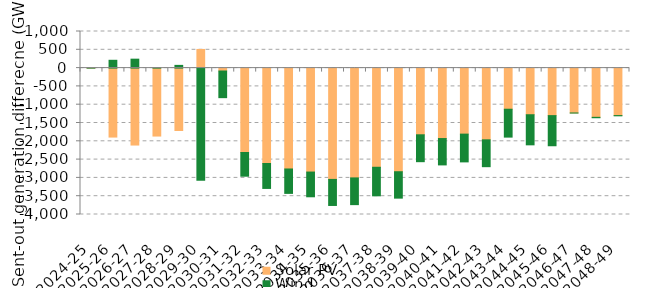
| Category | Solar PV | Wind | Offshore wind |
|---|---|---|---|
| 2024-25 | -0.437 | 0.261 | 0 |
| 2025-26 | -1884.587 | 213.413 | 0 |
| 2026-27 | -2102.259 | 244.121 | 0 |
| 2027-28 | -1856.682 | 11.29 | 0 |
| 2028-29 | -1704.798 | 74.339 | 0 |
| 2029-30 | 509.71 | -3064.85 | 0 |
| 2030-31 | -79.45 | -728.203 | 0 |
| 2031-32 | -2305.976 | -647.668 | 0 |
| 2032-33 | -2605.988 | -681.789 | 0 |
| 2033-34 | -2756.382 | -666.945 | 0 |
| 2034-35 | -2840.185 | -675.785 | 0 |
| 2035-36 | -3041.288 | -712.021 | 0 |
| 2036-37 | -3000.111 | -730.215 | 0 |
| 2037-38 | -2709.602 | -779.807 | 0 |
| 2038-39 | -2831.418 | -721.532 | 0 |
| 2039-40 | -1822.105 | -734.742 | 0 |
| 2040-41 | -1924.492 | -720.455 | 0 |
| 2041-42 | -1804.001 | -758.481 | 0 |
| 2042-43 | -1959.699 | -733.742 | 0 |
| 2043-44 | -1123.686 | -761.909 | 0 |
| 2044-45 | -1274.112 | -822.39 | 0 |
| 2045-46 | -1298.227 | -823.373 | 0 |
| 2046-47 | -1225.873 | -1.714 | 0 |
| 2047-48 | -1344.851 | -11.497 | 0 |
| 2048-49 | -1297.011 | -6.12 | 0 |